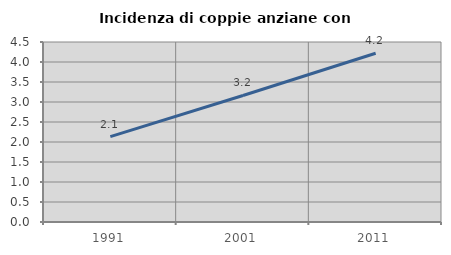
| Category | Incidenza di coppie anziane con figli |
|---|---|
| 1991.0 | 2.134 |
| 2001.0 | 3.163 |
| 2011.0 | 4.22 |